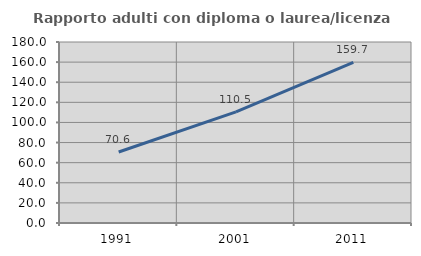
| Category | Rapporto adulti con diploma o laurea/licenza media  |
|---|---|
| 1991.0 | 70.626 |
| 2001.0 | 110.455 |
| 2011.0 | 159.704 |